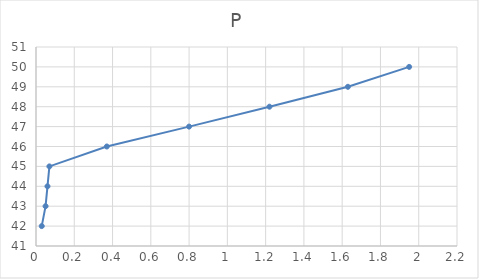
| Category | P |
|---|---|
| 0.03 | 42 |
| 0.05 | 43 |
| 0.06 | 44 |
| 0.07 | 45 |
| 0.37 | 46 |
| 0.8 | 47 |
| 1.22 | 48 |
| 1.63 | 49 |
| 1.95 | 50 |